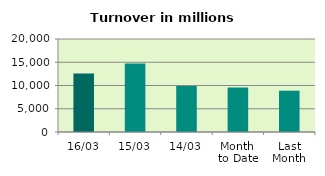
| Category | Series 0 |
|---|---|
| 16/03 | 12600.147 |
| 15/03 | 14742.906 |
| 14/03 | 9873.415 |
| Month 
to Date | 9570.48 |
| Last
Month | 8884.685 |